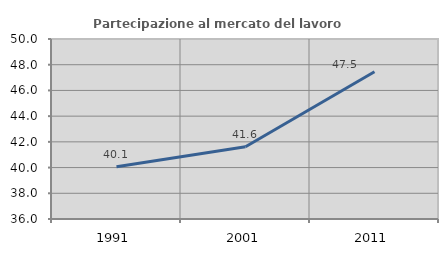
| Category | Partecipazione al mercato del lavoro  femminile |
|---|---|
| 1991.0 | 40.058 |
| 2001.0 | 41.625 |
| 2011.0 | 47.451 |